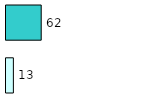
| Category | Series 0 | Series 1 |
|---|---|---|
| 0 | 13 | 62 |